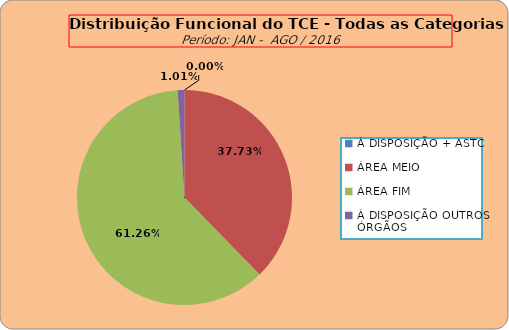
| Category | Series 0 |
|---|---|
| À DISPOSIÇÃO + ASTC | 0 |
| ÁREA MEIO | 186 |
| ÁREA FIM | 302 |
| À DISPOSIÇÃO OUTROS ÓRGÃOS | 5 |